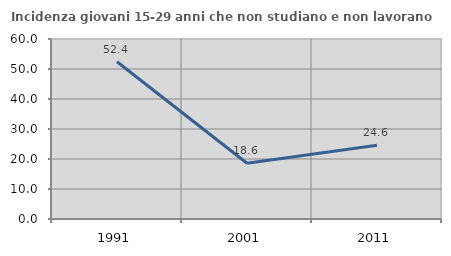
| Category | Incidenza giovani 15-29 anni che non studiano e non lavorano  |
|---|---|
| 1991.0 | 52.427 |
| 2001.0 | 18.571 |
| 2011.0 | 24.615 |